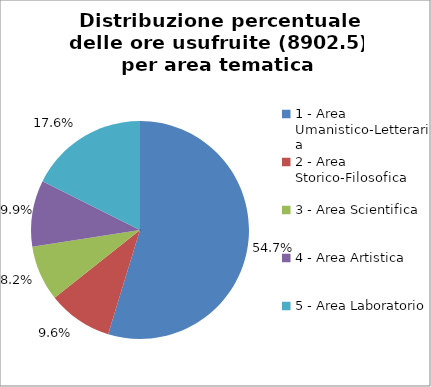
| Category | Nr. Ore Usufruite |
|---|---|
| 1 - Area Umanistico-Letteraria | 4872 |
| 2 - Area Storico-Filosofica | 855 |
| 3 - Area Scientifica | 732 |
| 4 - Area Artistica | 876 |
| 5 - Area Laboratorio | 1567.5 |